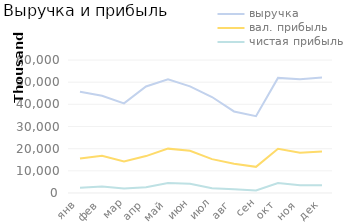
| Category | выручка | вал. прибыль | чистая прибыль |
|---|---|---|---|
| янв | 45648000 | 15528960 | 2396518.4 |
| фев | 43886854.512 | 16842256.06 | 2979905.943 |
| мар | 40449089.025 | 14265193.656 | 2015922.954 |
| апр | 48063035.194 | 16652601.588 | 2623903.329 |
| май | 51309222.108 | 20012841.761 | 4555384.933 |
| июн | 48082262.331 | 19053471.574 | 4153377.878 |
| июл | 43306498.766 | 15274168.529 | 2147320.561 |
| авг | 36790501.54 | 13204982.158 | 1704946.442 |
| сен | 34654295.001 | 11791173.857 | 1146805.557 |
| окт | 51932283.419 | 19932696.188 | 4515882.807 |
| ноя | 51370823.969 | 18118507.351 | 3491992.796 |
| дек | 52072216.8 | 18690009.403 | 3493216.441 |